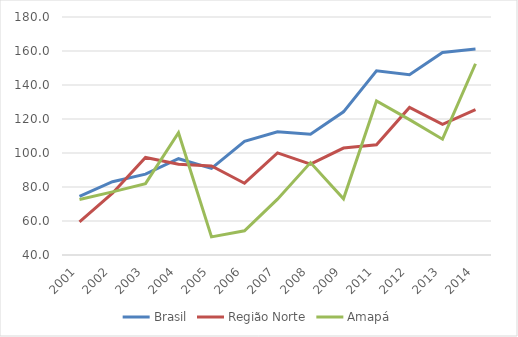
| Category | Brasil | Região Norte | Amapá |
|---|---|---|---|
| 2001.0 | 74.53 | 59.521 | 72.638 |
| 2002.0 | 83.092 | 76.341 | 77.134 |
| 2003.0 | 87.545 | 97.373 | 81.95 |
| 2004.0 | 96.651 | 93.349 | 111.943 |
| 2005.0 | 90.93 | 92.425 | 50.657 |
| 2006.0 | 106.812 | 82.229 | 54.223 |
| 2007.0 | 112.466 | 100.028 | 72.863 |
| 2008.0 | 111.013 | 93.466 | 94.349 |
| 2009.0 | 124.225 | 102.915 | 73.073 |
| 2011.0 | 148.383 | 104.804 | 130.577 |
| 2012.0 | 146.057 | 126.788 | 119.601 |
| 2013.0 | 159.169 | 116.842 | 108.117 |
| 2014.0 | 161.157 | 125.537 | 152.502 |